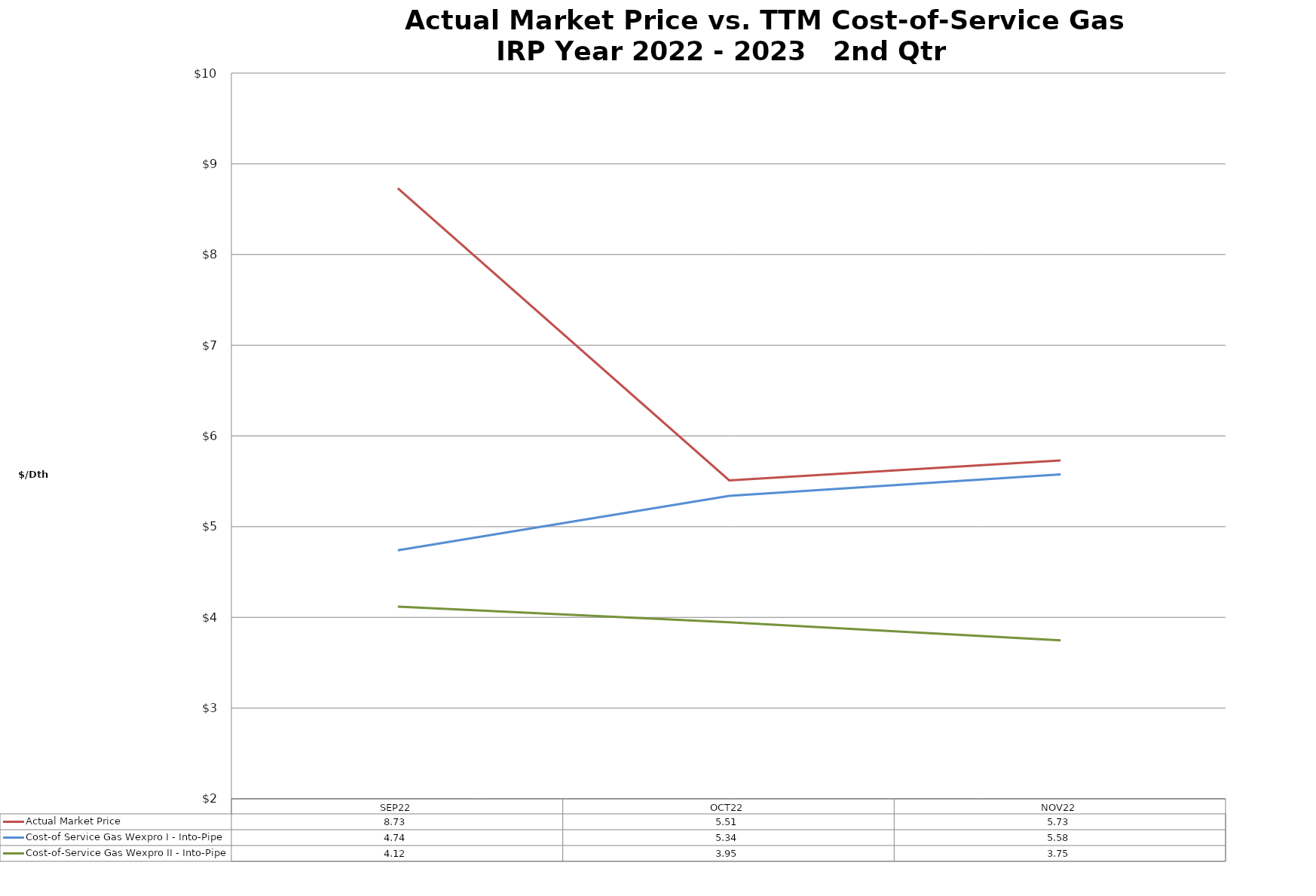
| Category | Actual Market Price | Cost-of Service Gas Wexpro I - Into-Pipe | Cost-of-Service Gas Wexpro II - Into-Pipe |
|---|---|---|---|
| SEP22 | 8.73 | 4.739 | 4.119 |
| OCT22 | 5.51 | 5.339 | 3.945 |
| NOV22 | 5.73 | 5.577 | 3.746 |